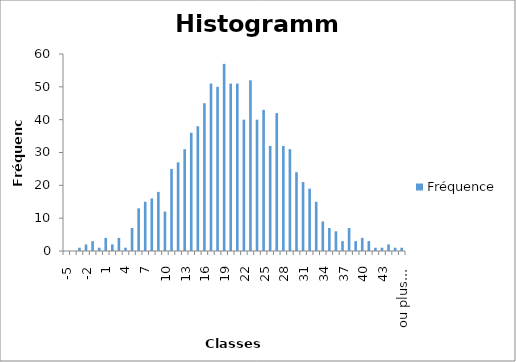
| Category | Fréquence |
|---|---|
| -5 | 0 |
| -4 | 0 |
| -3 | 1 |
| -2 | 2 |
| -1 | 3 |
| 0 | 1 |
| 1 | 4 |
| 2 | 2 |
| 3 | 4 |
| 4 | 1 |
| 5 | 7 |
| 6 | 13 |
| 7 | 15 |
| 8 | 16 |
| 9 | 18 |
| 10 | 12 |
| 11 | 25 |
| 12 | 27 |
| 13 | 31 |
| 14 | 36 |
| 15 | 38 |
| 16 | 45 |
| 17 | 51 |
| 18 | 50 |
| 19 | 57 |
| 20 | 51 |
| 21 | 51 |
| 22 | 40 |
| 23 | 52 |
| 24 | 40 |
| 25 | 43 |
| 26 | 32 |
| 27 | 42 |
| 28 | 32 |
| 29 | 31 |
| 30 | 24 |
| 31 | 21 |
| 32 | 19 |
| 33 | 15 |
| 34 | 9 |
| 35 | 7 |
| 36 | 6 |
| 37 | 3 |
| 38 | 7 |
| 39 | 3 |
| 40 | 4 |
| 41 | 3 |
| 42 | 1 |
| 43 | 1 |
| 44 | 2 |
| 45 | 1 |
| ou plus... | 1 |